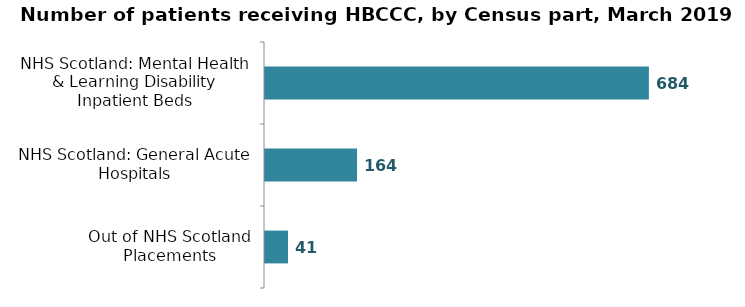
| Category | Series 0 |
|---|---|
| NHS Scotland: Mental Health & Learning Disability Inpatient Beds | 684 |
| NHS Scotland: General Acute Hospitals | 164 |
| Out of NHS Scotland Placements | 41 |